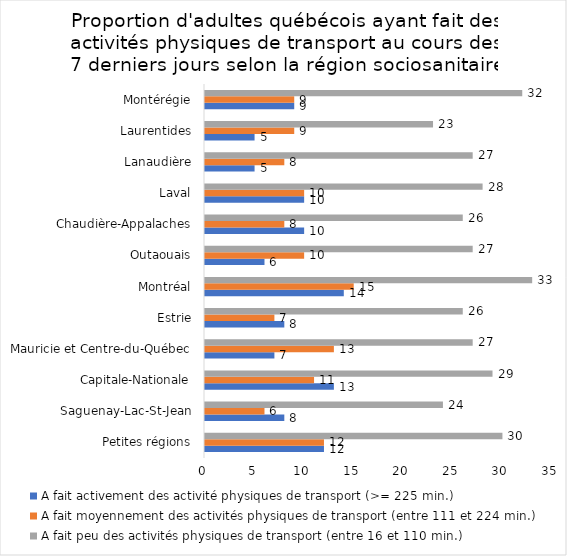
| Category | A fait activement des activité physiques de transport (>= 225 min.) | A fait moyennement des activités physiques de transport (entre 111 et 224 min.) | A fait peu des activités physiques de transport (entre 16 et 110 min.) |
|---|---|---|---|
| Petites régions | 12 | 12 | 30 |
| Saguenay-Lac-St-Jean | 8 | 6 | 24 |
| Capitale-Nationale | 13 | 11 | 29 |
| Mauricie et Centre-du-Québec | 7 | 13 | 27 |
| Estrie | 8 | 7 | 26 |
| Montréal | 14 | 15 | 33 |
| Outaouais | 6 | 10 | 27 |
| Chaudière-Appalaches | 10 | 8 | 26 |
| Laval | 10 | 10 | 28 |
| Lanaudière | 5 | 8 | 27 |
| Laurentides | 5 | 9 | 23 |
| Montérégie | 9 | 9 | 32 |